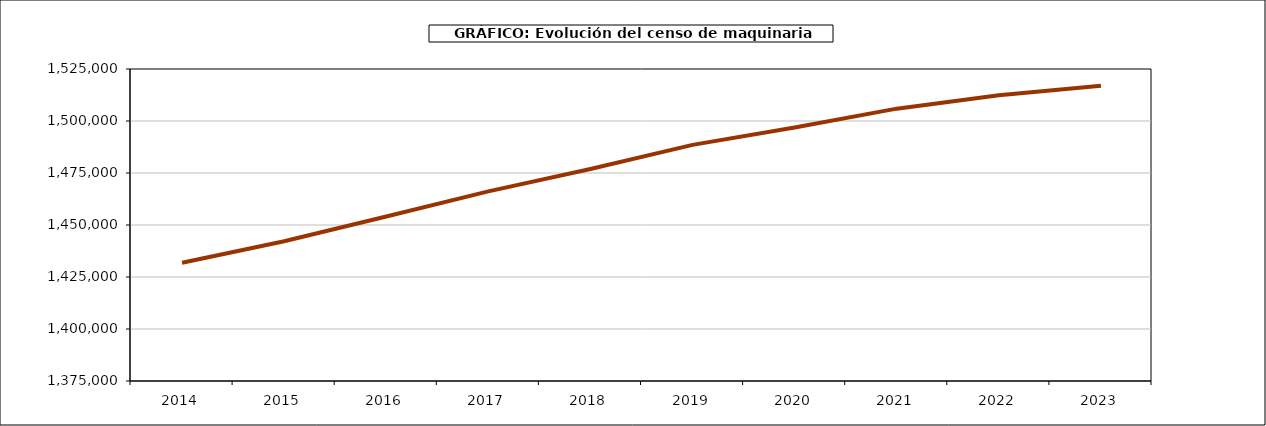
| Category | maquinaria |
|---|---|
| 2014.0 | 1431819 |
| 2015.0 | 1442169 |
| 2016.0 | 1454062 |
| 2017.0 | 1466159 |
| 2018.0 | 1476889 |
| 2019.0 | 1488523 |
| 2020.0 | 1496904 |
| 2021.0 | 1505938 |
| 2022.0 | 1512342 |
| 2023.0 | 1516917 |